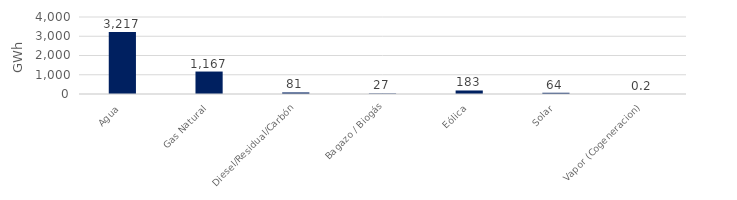
| Category | Series 0 |
|---|---|
| Agua | 3217.054 |
| Gas Natural | 1166.812 |
| Diesel/Residual/Carbón | 81.091 |
| Bagazo / Biogás | 27.148 |
| Eólica | 182.982 |
| Solar | 64.08 |
| Vapor (Cogeneracion) | 0.153 |